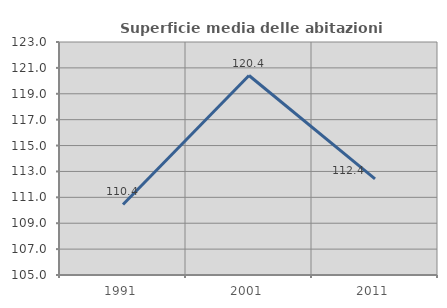
| Category | Superficie media delle abitazioni occupate |
|---|---|
| 1991.0 | 110.447 |
| 2001.0 | 120.411 |
| 2011.0 | 112.426 |